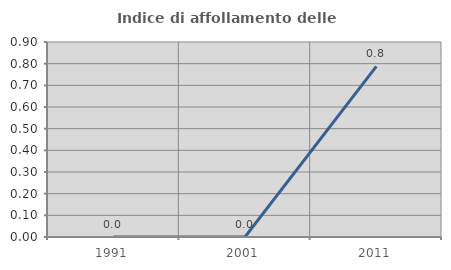
| Category | Indice di affollamento delle abitazioni  |
|---|---|
| 1991.0 | 0 |
| 2001.0 | 0 |
| 2011.0 | 0.787 |